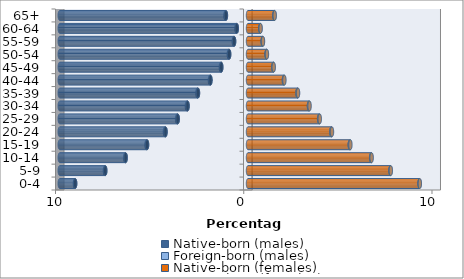
| Category | Native-born (males) | Foreign-born (males) | Native-born (females) | Foreign-born (females) |
|---|---|---|---|---|
| 0-4 | -9.182 | -0.012 | 9.114 | 0.012 |
| 5-9 | -7.583 | -0.018 | 7.567 | 0.02 |
| 10-14 | -6.5 | -0.024 | 6.543 | 0.027 |
| 15-19 | -5.362 | -0.03 | 5.408 | 0.033 |
| 20-24 | -4.381 | -0.032 | 4.427 | 0.034 |
| 25-29 | -3.733 | -0.034 | 3.779 | 0.035 |
| 30-34 | -3.212 | -0.034 | 3.238 | 0.034 |
| 35-39 | -2.658 | -0.032 | 2.63 | 0.03 |
| 40-44 | -1.995 | -0.028 | 1.908 | 0.026 |
| 45-49 | -1.42 | -0.023 | 1.345 | 0.022 |
| 50-54 | -1.001 | -0.02 | 0.987 | 0.018 |
| 55-59 | -0.739 | -0.017 | 0.781 | 0.015 |
| 60-64 | -0.596 | -0.016 | 0.656 | 0.013 |
| 65+ | -1.173 | -0.024 | 1.402 | 0.018 |